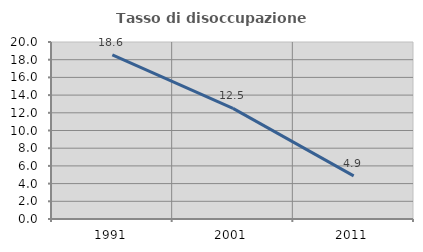
| Category | Tasso di disoccupazione giovanile  |
|---|---|
| 1991.0 | 18.557 |
| 2001.0 | 12.5 |
| 2011.0 | 4.878 |